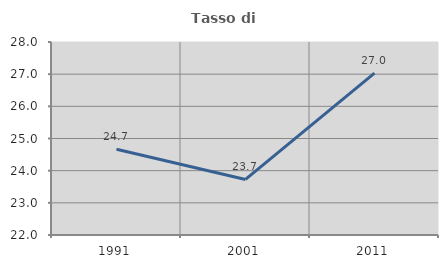
| Category | Tasso di occupazione   |
|---|---|
| 1991.0 | 24.664 |
| 2001.0 | 23.728 |
| 2011.0 | 27.031 |